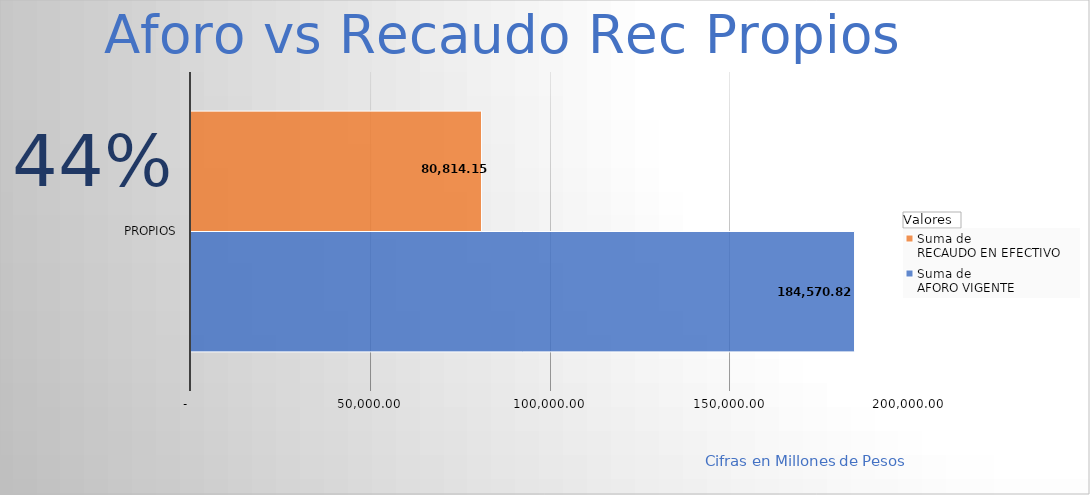
| Category | Suma de 
AFORO VIGENTE
 | Suma de 
RECAUDO EN EFECTIVO 
 |
|---|---|---|
| Propios | 184570.824 | 80814.152 |